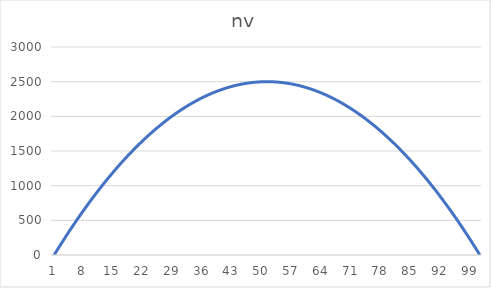
| Category | (n-1)*v |
|---|---|
| 0 | 0 |
| 1 | 99 |
| 2 | 196 |
| 3 | 291 |
| 4 | 384 |
| 5 | 475 |
| 6 | 564 |
| 7 | 651 |
| 8 | 736 |
| 9 | 819 |
| 10 | 900 |
| 11 | 979 |
| 12 | 1056 |
| 13 | 1131 |
| 14 | 1204 |
| 15 | 1275 |
| 16 | 1344 |
| 17 | 1411 |
| 18 | 1476 |
| 19 | 1539 |
| 20 | 1600 |
| 21 | 1659 |
| 22 | 1716 |
| 23 | 1771 |
| 24 | 1824 |
| 25 | 1875 |
| 26 | 1924 |
| 27 | 1971 |
| 28 | 2016 |
| 29 | 2059 |
| 30 | 2100 |
| 31 | 2139 |
| 32 | 2176 |
| 33 | 2211 |
| 34 | 2244 |
| 35 | 2275 |
| 36 | 2304 |
| 37 | 2331 |
| 38 | 2356 |
| 39 | 2379 |
| 40 | 2400 |
| 41 | 2419 |
| 42 | 2436 |
| 43 | 2451 |
| 44 | 2464 |
| 45 | 2475 |
| 46 | 2484 |
| 47 | 2491 |
| 48 | 2496 |
| 49 | 2499 |
| 50 | 2500 |
| 51 | 2499 |
| 52 | 2496 |
| 53 | 2491 |
| 54 | 2484 |
| 55 | 2475 |
| 56 | 2464 |
| 57 | 2451 |
| 58 | 2436 |
| 59 | 2419 |
| 60 | 2400 |
| 61 | 2379 |
| 62 | 2356 |
| 63 | 2331 |
| 64 | 2304 |
| 65 | 2275 |
| 66 | 2244 |
| 67 | 2211 |
| 68 | 2176 |
| 69 | 2139 |
| 70 | 2100 |
| 71 | 2059 |
| 72 | 2016 |
| 73 | 1971 |
| 74 | 1924 |
| 75 | 1875 |
| 76 | 1824 |
| 77 | 1771 |
| 78 | 1716 |
| 79 | 1659 |
| 80 | 1600 |
| 81 | 1539 |
| 82 | 1476 |
| 83 | 1411 |
| 84 | 1344 |
| 85 | 1275 |
| 86 | 1204 |
| 87 | 1131 |
| 88 | 1056 |
| 89 | 979 |
| 90 | 900 |
| 91 | 819 |
| 92 | 736 |
| 93 | 651 |
| 94 | 564 |
| 95 | 475 |
| 96 | 384 |
| 97 | 291 |
| 98 | 196 |
| 99 | 99 |
| 100 | 0 |